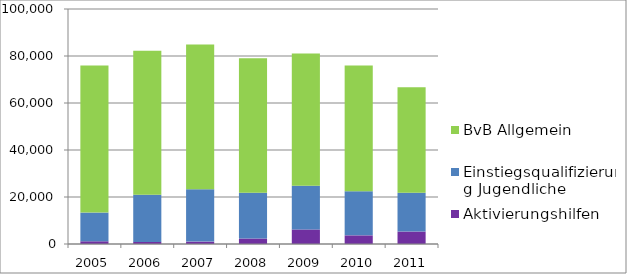
| Category | Aktivierungshilfen | Einstiegsqualifizierung Jugendliche | BvB Allgemein |
|---|---|---|---|
| 2005.0 | 1153 | 12221 | 62541 |
| 2006.0 | 896 | 20039 | 61311 |
| 2007.0 | 1012 | 22295 | 61631 |
| 2008.0 | 2330 | 19526 | 57211 |
| 2009.0 | 6183 | 18558 | 56272 |
| 2010.0 | 3678 | 18783 | 53476 |
| 2011.0 | 5295.917 | 16493 | 44872 |